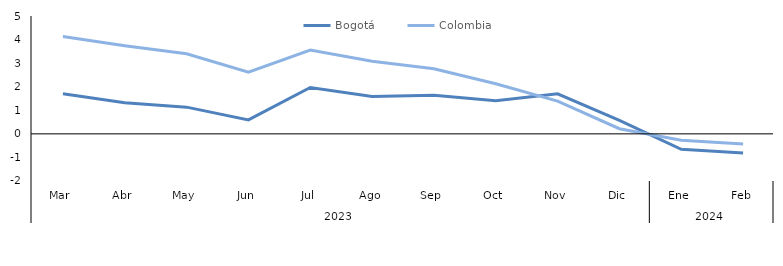
| Category | Bogotá | Colombia |
|---|---|---|
| 0 | 1.699 | 4.127 |
| 1 | 1.319 | 3.741 |
| 2 | 1.134 | 3.4 |
| 3 | 0.59 | 2.613 |
| 4 | 1.965 | 3.551 |
| 5 | 1.582 | 3.078 |
| 6 | 1.64 | 2.76 |
| 7 | 1.4 | 2.123 |
| 8 | 1.696 | 1.388 |
| 9 | 0.569 | 0.219 |
| 10 | -0.657 | -0.271 |
| 11 | -0.81 | -0.431 |